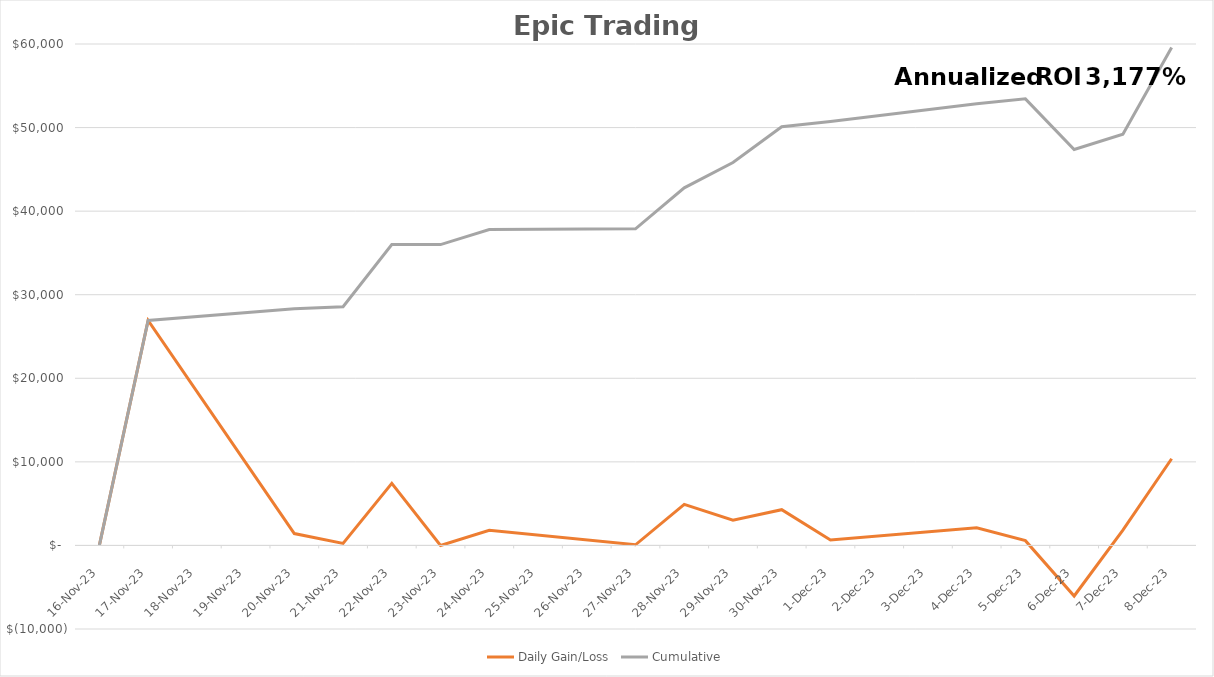
| Category | Daily Gain/Loss | Cumulative |
|---|---|---|
| 2023-11-16 | 0.2 | 0.2 |
| 2023-11-17 | 26913.8 | 26914 |
| 2023-11-20 | 1418 | 28332 |
| 2023-11-21 | 237 | 28569 |
| 2023-11-22 | 7429 | 35998 |
| 2023-11-23 | 0 | 35998 |
| 2023-11-24 | 1806 | 37804 |
| 2023-11-27 | 75 | 37879 |
| 2023-11-28 | 4913 | 42792 |
| 2023-11-29 | 3027 | 45819 |
| 2023-11-30 | 4280 | 50099 |
| 2023-12-01 | 641 | 50740 |
| 2023-12-04 | 2124 | 52864 |
| 2023-12-05 | 569 | 53433 |
| 2023-12-06 | -6053 | 47380 |
| 2023-12-07 | 1824 | 49204 |
| 2023-12-08 | 10369 | 59573 |